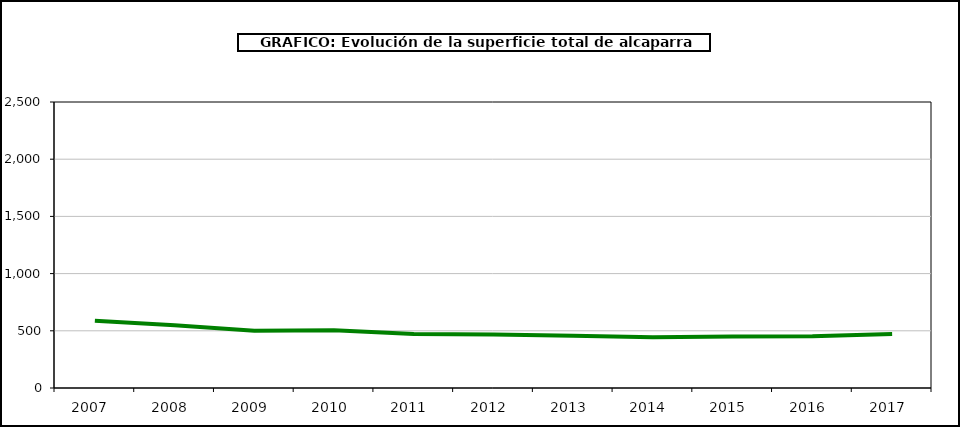
| Category | superficie |
|---|---|
| 2007.0 | 588 |
| 2008.0 | 548 |
| 2009.0 | 501 |
| 2010.0 | 504 |
| 2011.0 | 471 |
| 2012.0 | 467 |
| 2013.0 | 456 |
| 2014.0 | 443 |
| 2015.0 | 450 |
| 2016.0 | 453 |
| 2017.0 | 472 |